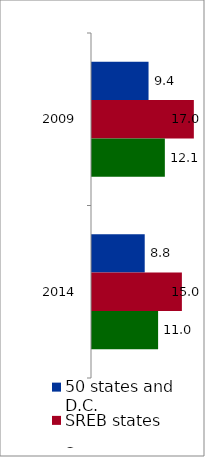
| Category | 50 states and D.C. | SREB states | State |
|---|---|---|---|
| 2009 | 9.424 | 16.974 | 12.142 |
| 2014 | 8.786 | 14.982 | 11.018 |